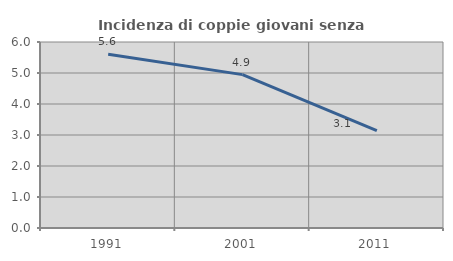
| Category | Incidenza di coppie giovani senza figli |
|---|---|
| 1991.0 | 5.603 |
| 2001.0 | 4.948 |
| 2011.0 | 3.139 |